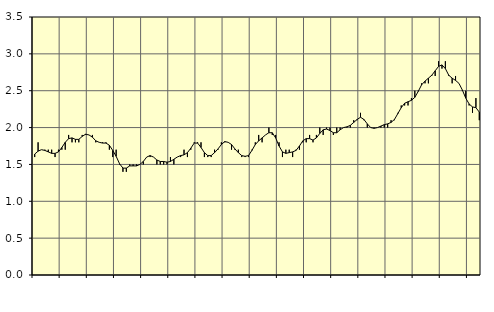
| Category | Piggar | Series 1 |
|---|---|---|
| nan | 1.6 | 1.64 |
| 87.0 | 1.8 | 1.68 |
| 87.0 | 1.7 | 1.7 |
| 87.0 | 1.7 | 1.69 |
| nan | 1.7 | 1.67 |
| 88.0 | 1.7 | 1.65 |
| 88.0 | 1.6 | 1.65 |
| 88.0 | 1.7 | 1.67 |
| nan | 1.7 | 1.73 |
| 89.0 | 1.7 | 1.8 |
| 89.0 | 1.9 | 1.85 |
| 89.0 | 1.8 | 1.86 |
| nan | 1.8 | 1.84 |
| 90.0 | 1.8 | 1.84 |
| 90.0 | 1.9 | 1.88 |
| 90.0 | 1.9 | 1.91 |
| nan | 1.9 | 1.9 |
| 91.0 | 1.9 | 1.87 |
| 91.0 | 1.8 | 1.82 |
| 91.0 | 1.8 | 1.8 |
| nan | 1.8 | 1.79 |
| 92.0 | 1.8 | 1.79 |
| 92.0 | 1.7 | 1.76 |
| 92.0 | 1.6 | 1.69 |
| nan | 1.7 | 1.61 |
| 93.0 | 1.5 | 1.51 |
| 93.0 | 1.4 | 1.45 |
| 93.0 | 1.4 | 1.45 |
| nan | 1.5 | 1.48 |
| 94.0 | 1.5 | 1.48 |
| 94.0 | 1.5 | 1.48 |
| 94.0 | 1.5 | 1.5 |
| nan | 1.5 | 1.54 |
| 95.0 | 1.6 | 1.6 |
| 95.0 | 1.6 | 1.62 |
| 95.0 | 1.6 | 1.6 |
| nan | 1.5 | 1.56 |
| 96.0 | 1.5 | 1.54 |
| 96.0 | 1.5 | 1.54 |
| 96.0 | 1.5 | 1.53 |
| nan | 1.6 | 1.54 |
| 97.0 | 1.5 | 1.57 |
| 97.0 | 1.6 | 1.6 |
| 97.0 | 1.6 | 1.62 |
| nan | 1.7 | 1.63 |
| 98.0 | 1.6 | 1.66 |
| 98.0 | 1.7 | 1.72 |
| 98.0 | 1.8 | 1.79 |
| nan | 1.8 | 1.79 |
| 99.0 | 1.8 | 1.73 |
| 99.0 | 1.6 | 1.66 |
| 99.0 | 1.6 | 1.62 |
| nan | 1.6 | 1.62 |
| 0.0 | 1.7 | 1.66 |
| 0.0 | 1.7 | 1.71 |
| 0.0 | 1.8 | 1.77 |
| nan | 1.8 | 1.81 |
| 1.0 | 1.8 | 1.8 |
| 1.0 | 1.7 | 1.77 |
| 1.0 | 1.7 | 1.71 |
| nan | 1.7 | 1.66 |
| 2.0 | 1.6 | 1.62 |
| 2.0 | 1.6 | 1.61 |
| 2.0 | 1.6 | 1.62 |
| nan | 1.7 | 1.69 |
| 3.0 | 1.8 | 1.77 |
| 3.0 | 1.9 | 1.82 |
| 3.0 | 1.8 | 1.86 |
| nan | 1.9 | 1.9 |
| 4.0 | 2 | 1.93 |
| 4.0 | 1.9 | 1.93 |
| 4.0 | 1.9 | 1.86 |
| nan | 1.8 | 1.75 |
| 5.0 | 1.6 | 1.67 |
| 5.0 | 1.7 | 1.65 |
| 5.0 | 1.7 | 1.66 |
| nan | 1.6 | 1.67 |
| 6.0 | 1.7 | 1.69 |
| 6.0 | 1.7 | 1.75 |
| 6.0 | 1.8 | 1.82 |
| nan | 1.8 | 1.85 |
| 7.0 | 1.9 | 1.85 |
| 7.0 | 1.8 | 1.83 |
| 7.0 | 1.9 | 1.86 |
| nan | 2 | 1.92 |
| 8.0 | 1.9 | 1.97 |
| 8.0 | 2 | 1.98 |
| 8.0 | 2 | 1.96 |
| nan | 1.9 | 1.93 |
| 9.0 | 2 | 1.93 |
| 9.0 | 2 | 1.97 |
| 9.0 | 2 | 2 |
| nan | 2 | 2.01 |
| 10.0 | 2 | 2.03 |
| 10.0 | 2.1 | 2.07 |
| 10.0 | 2.1 | 2.11 |
| nan | 2.2 | 2.14 |
| 11.0 | 2.1 | 2.11 |
| 11.0 | 2 | 2.05 |
| 11.0 | 2 | 2 |
| nan | 2 | 1.99 |
| 12.0 | 2 | 2 |
| 12.0 | 2 | 2.02 |
| 12.0 | 2 | 2.04 |
| nan | 2 | 2.05 |
| 13.0 | 2.1 | 2.07 |
| 13.0 | 2.1 | 2.11 |
| 13.0 | 2.2 | 2.19 |
| nan | 2.3 | 2.27 |
| 14.0 | 2.3 | 2.33 |
| 14.0 | 2.3 | 2.35 |
| 14.0 | 2.4 | 2.37 |
| nan | 2.5 | 2.41 |
| 15.0 | 2.5 | 2.49 |
| 15.0 | 2.6 | 2.58 |
| 15.0 | 2.6 | 2.63 |
| nan | 2.6 | 2.67 |
| 16.0 | 2.7 | 2.71 |
| 16.0 | 2.7 | 2.77 |
| 16.0 | 2.9 | 2.83 |
| nan | 2.8 | 2.85 |
| 17.0 | 2.9 | 2.8 |
| 17.0 | 2.7 | 2.71 |
| 17.0 | 2.6 | 2.67 |
| nan | 2.7 | 2.64 |
| 18.0 | 2.6 | 2.6 |
| 18.0 | 2.5 | 2.51 |
| 18.0 | 2.5 | 2.4 |
| nan | 2.3 | 2.32 |
| 19.0 | 2.2 | 2.28 |
| 19.0 | 2.4 | 2.27 |
| 19.0 | 2.1 | 2.21 |